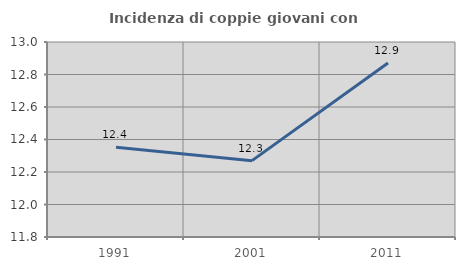
| Category | Incidenza di coppie giovani con figli |
|---|---|
| 1991.0 | 12.353 |
| 2001.0 | 12.27 |
| 2011.0 | 12.871 |